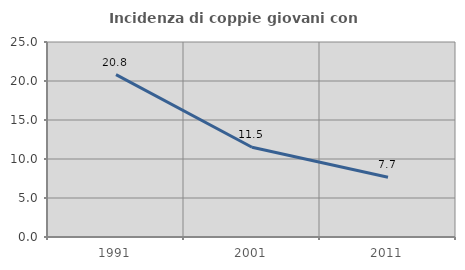
| Category | Incidenza di coppie giovani con figli |
|---|---|
| 1991.0 | 20.826 |
| 2001.0 | 11.503 |
| 2011.0 | 7.669 |